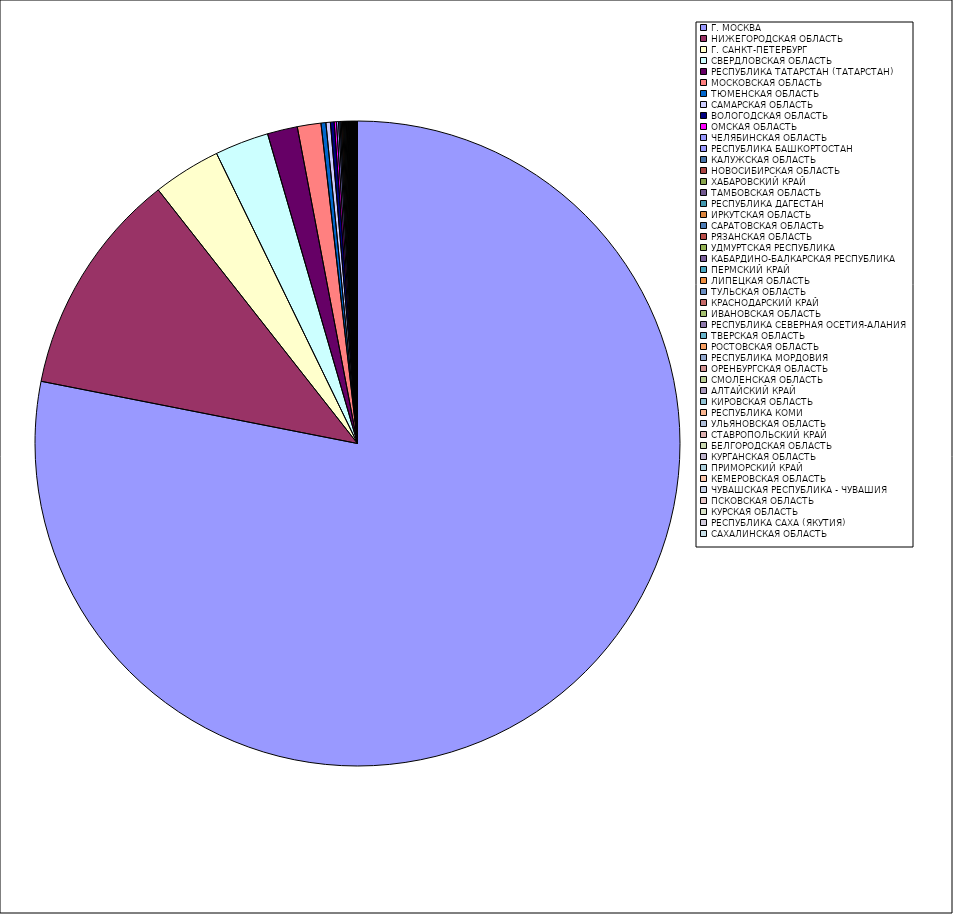
| Category | Оборот |
|---|---|
| Г. МОСКВА | 78.064 |
| НИЖЕГОРОДСКАЯ ОБЛАСТЬ | 11.306 |
| Г. САНКТ-ПЕТЕРБУРГ | 3.399 |
| СВЕРДЛОВСКАЯ ОБЛАСТЬ | 2.701 |
| РЕСПУБЛИКА ТАТАРСТАН (ТАТАРСТАН) | 1.504 |
| МОСКОВСКАЯ ОБЛАСТЬ | 1.184 |
| ТЮМЕНСКАЯ ОБЛАСТЬ | 0.244 |
| САМАРСКАЯ ОБЛАСТЬ | 0.223 |
| ВОЛОГОДСКАЯ ОБЛАСТЬ | 0.188 |
| ОМСКАЯ ОБЛАСТЬ | 0.112 |
| ЧЕЛЯБИНСКАЯ ОБЛАСТЬ | 0.102 |
| РЕСПУБЛИКА БАШКОРТОСТАН | 0.07 |
| КАЛУЖСКАЯ ОБЛАСТЬ | 0.062 |
| НОВОСИБИРСКАЯ ОБЛАСТЬ | 0.061 |
| ХАБАРОВСКИЙ КРАЙ | 0.051 |
| ТАМБОВСКАЯ ОБЛАСТЬ | 0.05 |
| РЕСПУБЛИКА ДАГЕСТАН | 0.05 |
| ИРКУТСКАЯ ОБЛАСТЬ | 0.041 |
| САРАТОВСКАЯ ОБЛАСТЬ | 0.036 |
| РЯЗАНСКАЯ ОБЛАСТЬ | 0.035 |
| УДМУРТСКАЯ РЕСПУБЛИКА | 0.034 |
| КАБАРДИНО-БАЛКАРСКАЯ РЕСПУБЛИКА | 0.032 |
| ПЕРМСКИЙ КРАЙ | 0.03 |
| ЛИПЕЦКАЯ ОБЛАСТЬ | 0.029 |
| ТУЛЬСКАЯ ОБЛАСТЬ | 0.028 |
| КРАСНОДАРСКИЙ КРАЙ | 0.028 |
| ИВАНОВСКАЯ ОБЛАСТЬ | 0.028 |
| РЕСПУБЛИКА СЕВЕРНАЯ ОСЕТИЯ-АЛАНИЯ | 0.028 |
| ТВЕРСКАЯ ОБЛАСТЬ | 0.024 |
| РОСТОВСКАЯ ОБЛАСТЬ | 0.022 |
| РЕСПУБЛИКА МОРДОВИЯ | 0.022 |
| ОРЕНБУРГСКАЯ ОБЛАСТЬ | 0.022 |
| СМОЛЕНСКАЯ ОБЛАСТЬ | 0.02 |
| АЛТАЙСКИЙ КРАЙ | 0.018 |
| КИРОВСКАЯ ОБЛАСТЬ | 0.016 |
| РЕСПУБЛИКА КОМИ | 0.014 |
| УЛЬЯНОВСКАЯ ОБЛАСТЬ | 0.011 |
| СТАВРОПОЛЬСКИЙ КРАЙ | 0.01 |
| БЕЛГОРОДСКАЯ ОБЛАСТЬ | 0.01 |
| КУРГАНСКАЯ ОБЛАСТЬ | 0.01 |
| ПРИМОРСКИЙ КРАЙ | 0.008 |
| КЕМЕРОВСКАЯ ОБЛАСТЬ | 0.008 |
| ЧУВАШСКАЯ РЕСПУБЛИКА - ЧУВАШИЯ | 0.007 |
| ПСКОВСКАЯ ОБЛАСТЬ | 0.007 |
| КУРСКАЯ ОБЛАСТЬ | 0.006 |
| РЕСПУБЛИКА САХА (ЯКУТИЯ) | 0.006 |
| САХАЛИНСКАЯ ОБЛАСТЬ | 0.005 |